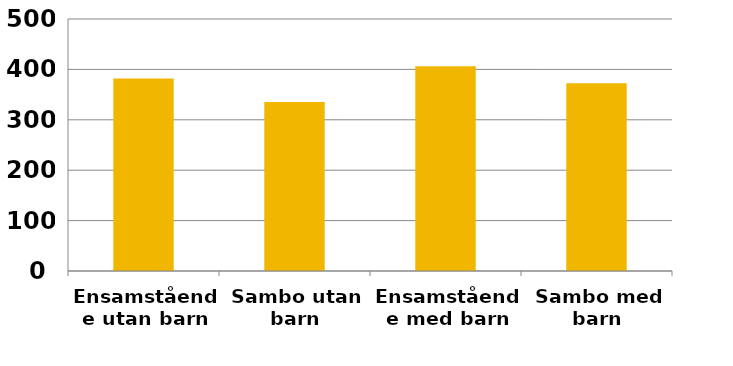
| Category | 2014 |
|---|---|
| Ensamstående utan barn | 381.96 |
| Sambo utan barn | 335.391 |
| Ensamstående med barn | 406.193 |
| Sambo med barn | 372.513 |